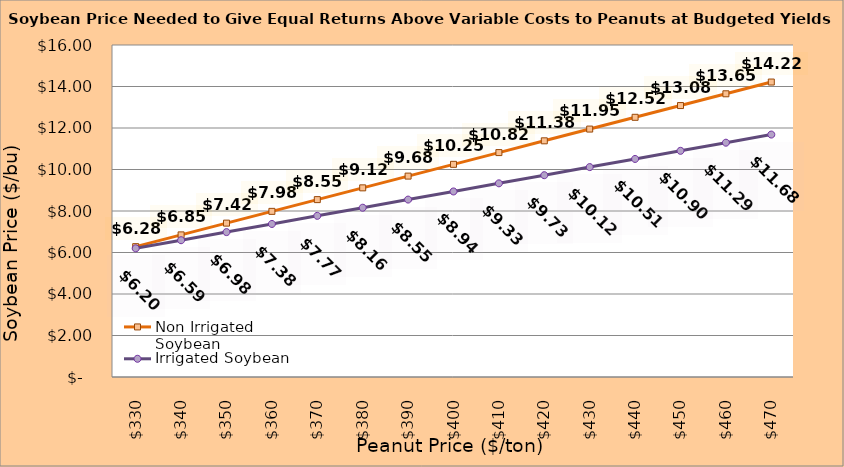
| Category | Non Irrigated Soybean | Irrigated Soybean |
|---|---|---|
| 330.0 | 6.282 | 6.2 |
| 340.0 | 6.849 | 6.592 |
| 350.0 | 7.415 | 6.983 |
| 360.0 | 7.982 | 7.375 |
| 370.0 | 8.549 | 7.767 |
| 380.0 | 9.115 | 8.158 |
| 390.0 | 9.682 | 8.55 |
| 400.0 | 10.249 | 8.942 |
| 410.0 | 10.815 | 9.333 |
| 420.0 | 11.382 | 9.725 |
| 430.0 | 11.949 | 10.117 |
| 440.0 | 12.515 | 10.508 |
| 450.0 | 13.082 | 10.9 |
| 460.0 | 13.649 | 11.292 |
| 470.0 | 14.215 | 11.683 |